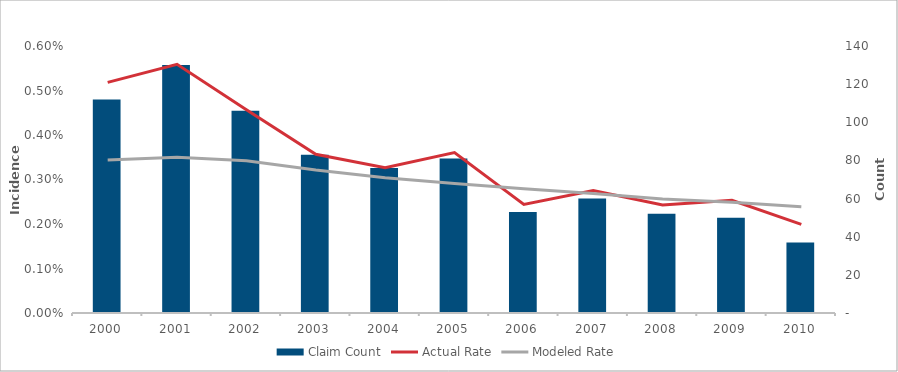
| Category | Claim Count |
|---|---|
| 2000.0 | 112 |
| 2001.0 | 130 |
| 2002.0 | 106 |
| 2003.0 | 83 |
| 2004.0 | 76 |
| 2005.0 | 81 |
| 2006.0 | 53 |
| 2007.0 | 60 |
| 2008.0 | 52 |
| 2009.0 | 50 |
| 2010.0 | 37 |